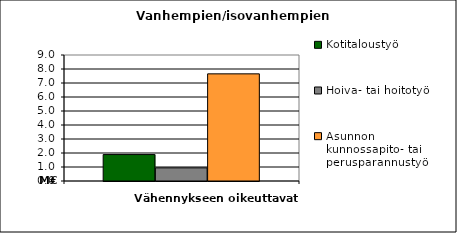
| Category | Kotitaloustyö | Hoiva- tai hoitotyö | Asunnon kunnossapito- tai perusparannustyö |
|---|---|---|---|
| 0 | 1887465.03 | 938016.48 | 7653328.25 |